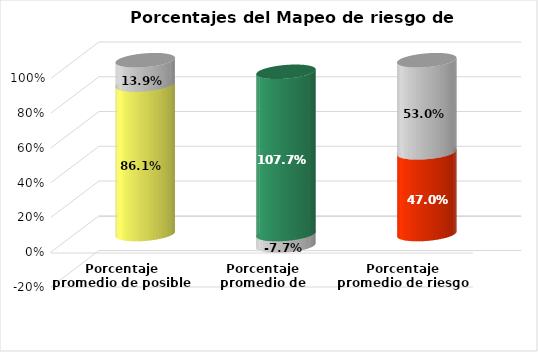
| Category | Series 0 | Series 1 |
|---|---|---|
| Porcentaje promedio de posible impacto | 0.861 | 0.139 |
| Porcentaje promedio de probabilidad de ocurrencia | 1.077 | -0.077 |
| Porcentaje promedio de riesgo de corrupción | 0.47 | 0.53 |